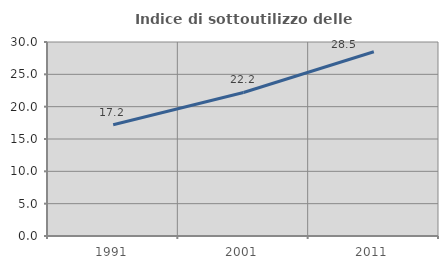
| Category | Indice di sottoutilizzo delle abitazioni  |
|---|---|
| 1991.0 | 17.197 |
| 2001.0 | 22.197 |
| 2011.0 | 28.497 |